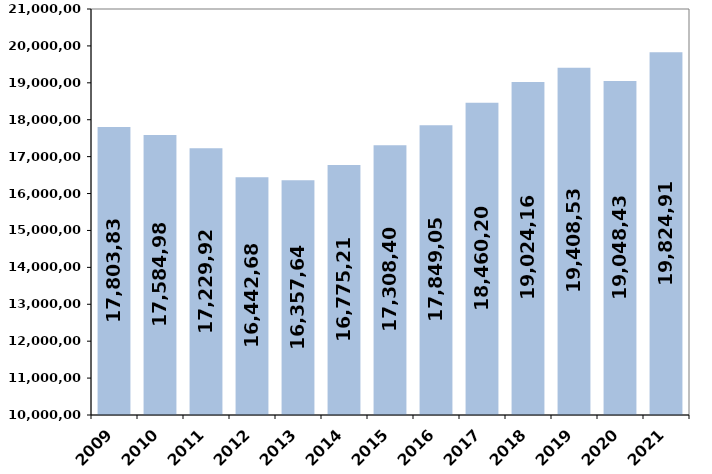
| Category | % de variación
 interanual |
|---|---|
| 2009 | 17803839 |
| 2010 | 17584981.63 |
| 2011 | 17229921.5 |
| 2012 | 16442681.23 |
| 2013 | 16357640.05 |
| 2014 | 16775214.47 |
| 2015 | 17308400 |
| 2016 | 17849054.5 |
| 2017 | 18460200.52 |
| 2018 | 19024165.17 |
| 2019 | 19408538 |
| 2020 | 19048433 |
| 2021 | 19824911.211 |